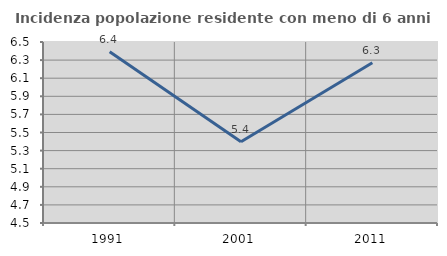
| Category | Incidenza popolazione residente con meno di 6 anni |
|---|---|
| 1991.0 | 6.393 |
| 2001.0 | 5.399 |
| 2011.0 | 6.271 |